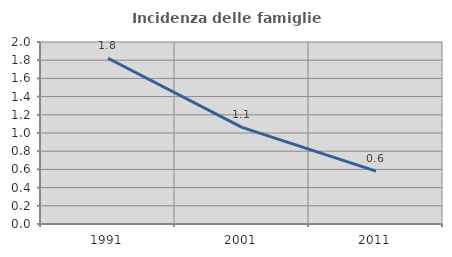
| Category | Incidenza delle famiglie numerose |
|---|---|
| 1991.0 | 1.821 |
| 2001.0 | 1.062 |
| 2011.0 | 0.581 |